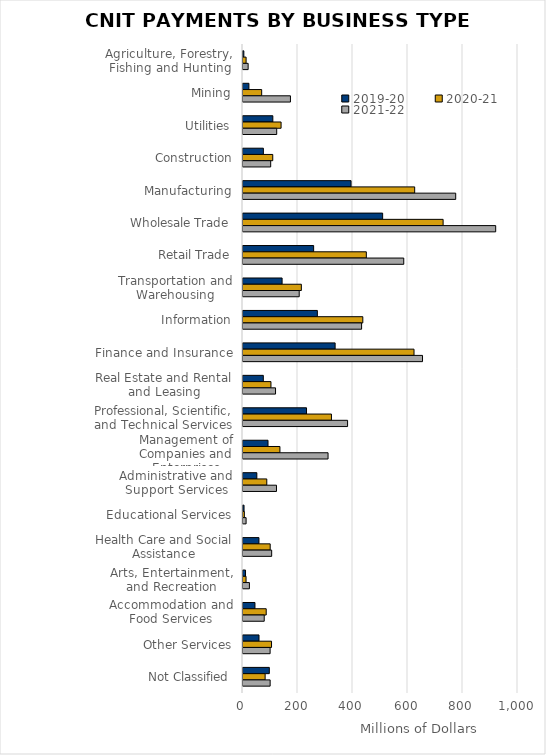
| Category | 2019-20 | 2020-21 | 2021-22 |
|---|---|---|---|
| Agriculture, Forestry, Fishing and Hunting | 3.1 | 11.3 | 18.7 |
| Mining | 21.5 | 67.9 | 172.5 |
| Utilities | 108.5 | 138.5 | 122.6 |
| Construction | 74.1 | 108.2 | 100.7 |
| Manufacturing | 392.9 | 624.3 | 773.5 |
| Wholesale Trade | 507.8 | 727.7 | 918.9 |
| Retail Trade | 256.9 | 448.5 | 584.6 |
| Transportation and Warehousing | 142.2 | 212.2 | 204.4 |
| Information | 270.4 | 435.7 | 431.3 |
| Finance and Insurance | 335 | 621.9 | 652.8 |
| Real Estate and Rental and Leasing | 73.9 | 101.7 | 118.3 |
| Professional, Scientific, and Technical Services | 231 | 321.6 | 380.3 |
| Management of Companies and Enterprises | 91 | 134.3 | 309.3 |
| Administrative and Support Services | 50.3 | 86.5 | 121.8 |
| Educational Services | 3.8 | 4.9 | 11.3 |
| Health Care and Social Assistance | 58 | 98.9 | 104.3 |
| Arts, Entertainment, and Recreation | 9.2 | 11.1 | 23.3 |
| Accommodation and Food Services | 43.5 | 84.4 | 77.2 |
| Other Services | 58.2 | 103.8 | 98.6 |
| Not Classified | 95.7 | 80.5 | 98.7 |